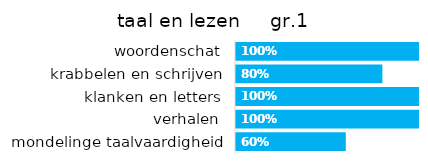
| Category | taal en lezen gr.1 |
|---|---|
| mondelinge taalvaardigheid | 0.6 |
| verhalen | 1 |
| klanken en letters | 1 |
| krabbelen en schrijven | 0.8 |
| woordenschat | 1 |